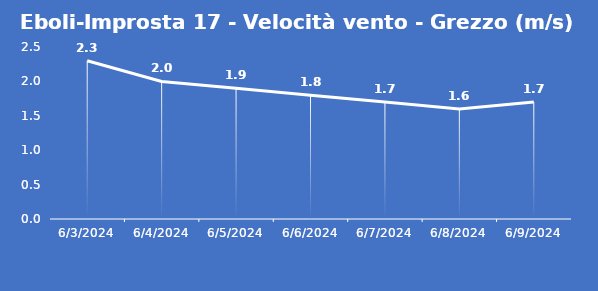
| Category | Eboli-Improsta 17 - Velocità vento - Grezzo (m/s) |
|---|---|
| 6/3/24 | 2.3 |
| 6/4/24 | 2 |
| 6/5/24 | 1.9 |
| 6/6/24 | 1.8 |
| 6/7/24 | 1.7 |
| 6/8/24 | 1.6 |
| 6/9/24 | 1.7 |